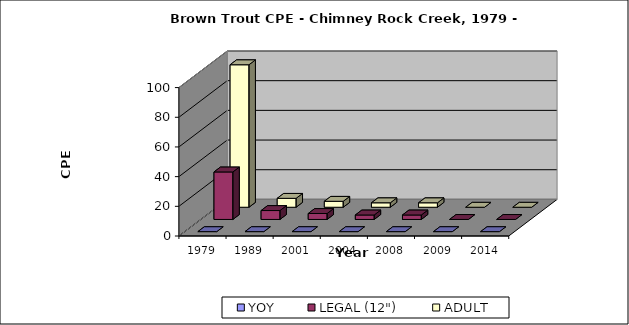
| Category | YOY | LEGAL (12") | ADULT |
|---|---|---|---|
| 1979.0 | 0 | 32 | 96 |
| 1989.0 | 0 | 6 | 6 |
| 2001.0 | 0 | 4 | 4 |
| 2004.0 | 0 | 3 | 3 |
| 2008.0 | 0 | 3 | 3 |
| 2009.0 | 0 | 0 | 0 |
| 2014.0 | 0 | 0 | 0 |